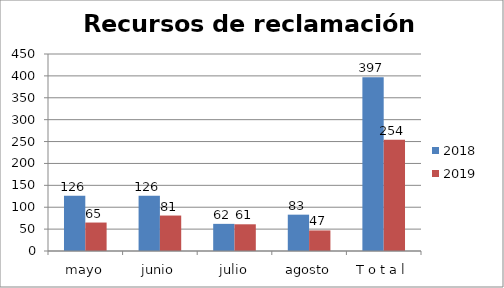
| Category | 2018 | 2019 |
|---|---|---|
| mayo | 126 | 65 |
| junio | 126 | 81 |
| julio | 62 | 61 |
| agosto | 83 | 47 |
| T o t a l | 397 | 254 |